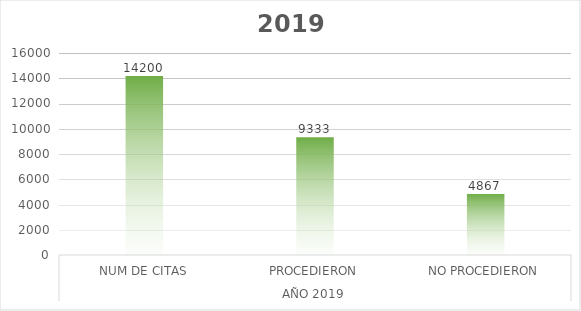
| Category | Series 0 |
|---|---|
| 0 | 14200 |
| 1 | 9333 |
| 2 | 4867 |